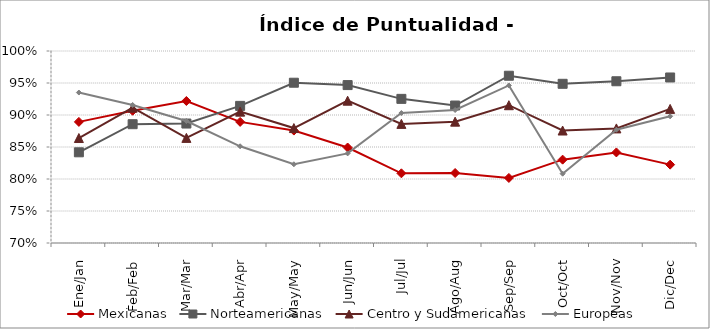
| Category | Mexicanas | Norteamericanas | Centro y Sudamericanas | Europeas |
|---|---|---|---|---|
| Ene/Jan | 0.889 | 0.842 | 0.864 | 0.935 |
| Feb/Feb | 0.907 | 0.886 | 0.911 | 0.916 |
| Mar/Mar | 0.922 | 0.887 | 0.864 | 0.891 |
| Abr/Apr | 0.889 | 0.914 | 0.905 | 0.851 |
| May/May | 0.876 | 0.95 | 0.88 | 0.823 |
| Jun/Jun | 0.849 | 0.947 | 0.922 | 0.84 |
| Jul/Jul | 0.809 | 0.925 | 0.886 | 0.903 |
| Ago/Aug | 0.809 | 0.915 | 0.89 | 0.908 |
| Sep/Sep | 0.802 | 0.961 | 0.915 | 0.946 |
| Oct/Oct | 0.83 | 0.949 | 0.876 | 0.808 |
| Nov/Nov | 0.842 | 0.953 | 0.879 | 0.877 |
| Dic/Dec | 0.822 | 0.959 | 0.91 | 0.898 |